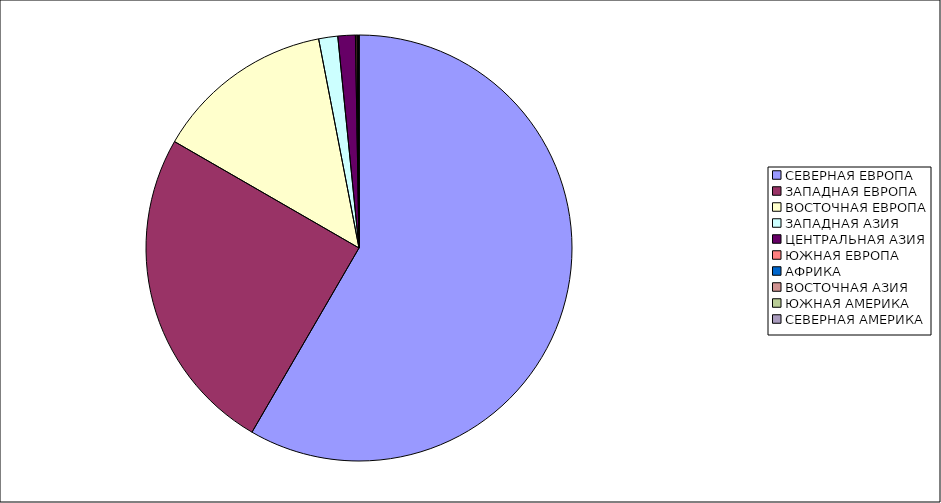
| Category | Оборот |
|---|---|
| СЕВЕРНАЯ ЕВРОПА | 58.375 |
| ЗАПАДНАЯ ЕВРОПА | 24.952 |
| ВОСТОЧНАЯ ЕВРОПА | 13.636 |
| ЗАПАДНАЯ АЗИЯ | 1.445 |
| ЦЕНТРАЛЬНАЯ АЗИЯ | 1.324 |
| ЮЖНАЯ ЕВРОПА | 0.112 |
| АФРИКА | 0.065 |
| ВОСТОЧНАЯ АЗИЯ | 0.051 |
| ЮЖНАЯ АМЕРИКА | 0.037 |
| СЕВЕРНАЯ АМЕРИКА | 0.003 |